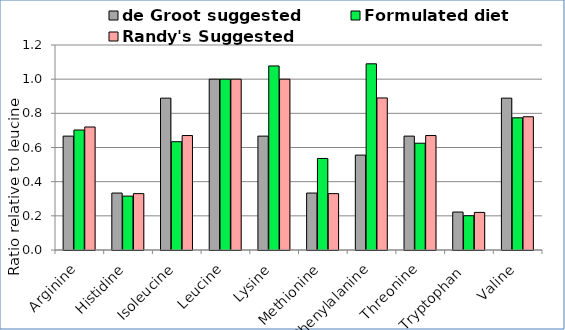
| Category | de Groot suggested | Formulated diet | Randy's Suggested |
|---|---|---|---|
| Arginine | 0.667 | 0.702 | 0.72 |
| Histidine | 0.333 | 0.315 | 0.33 |
| Isoleucine | 0.889 | 0.634 | 0.67 |
| Leucine | 1 | 1 | 1 |
| Lysine | 0.667 | 1.077 | 1 |
| Methionine | 0.333 | 0.536 | 0.33 |
| Phenylalanine | 0.556 | 1.09 | 0.89 |
| Threonine | 0.667 | 0.625 | 0.67 |
| Tryptophan  | 0.222 | 0.201 | 0.22 |
| Valine | 0.889 | 0.774 | 0.78 |